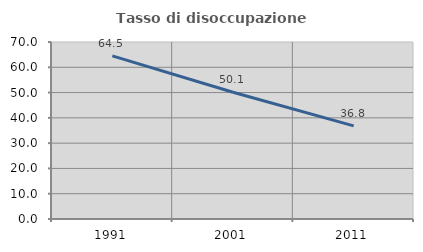
| Category | Tasso di disoccupazione giovanile  |
|---|---|
| 1991.0 | 64.533 |
| 2001.0 | 50.122 |
| 2011.0 | 36.842 |